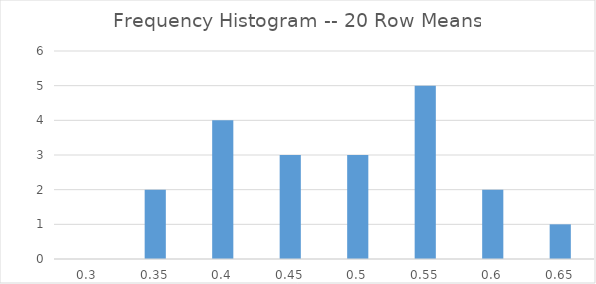
| Category | Series 0 |
|---|---|
| 0.3 | 0 |
| 0.35 | 2 |
| 0.4 | 4 |
| 0.45 | 3 |
| 0.5 | 3 |
| 0.55 | 5 |
| 0.6 | 2 |
| 0.65 | 1 |